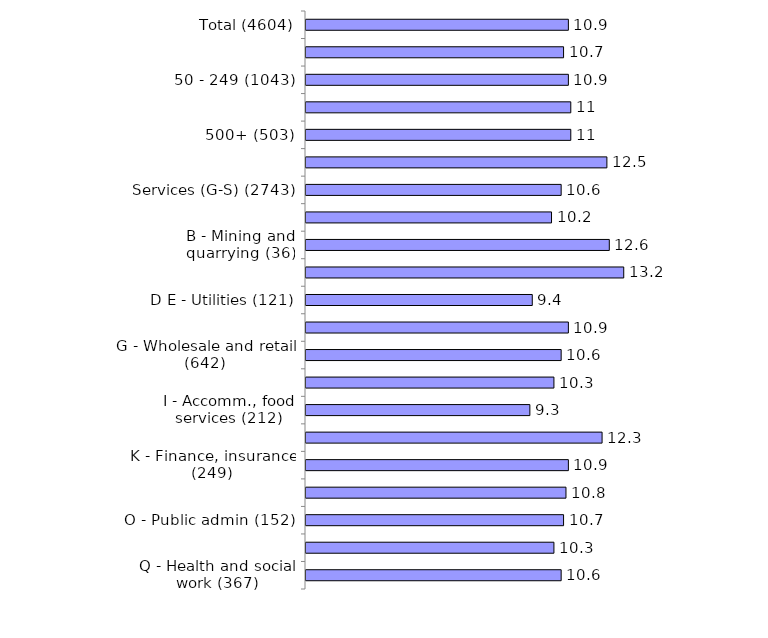
| Category | Series 0 |
|---|---|
| Total (4604) | 10.9 |
| 10-49 (2678) | 10.7 |
| 50 - 249 (1043) | 10.9 |
| 250 - 499 (380) | 11 |
| 500+ (503) | 11 |
| Production (A-F) (1861) | 12.5 |
| Services (G-S) (2743) | 10.6 |
| A - Agriculture (135) | 10.2 |
| B - Mining and quarrying (36) | 12.6 |
| C - Manufacturing (1396) | 13.2 |
| D E - Utilities (121) | 9.4 |
| F - Construction (173) | 10.9 |
| G - Wholesale and retail (642) | 10.6 |
| H - Transport, storage (203) | 10.3 |
| I - Accomm., food services (212) | 9.3 |
| J - Information, comms (170) | 12.3 |
| K - Finance, insurance (249) | 10.9 |
| LMNRS - Bus/tech/admin/arts/other (366) | 10.8 |
| O - Public admin (152) | 10.7 |
| P - Education (382) | 10.3 |
| Q - Health and social work (367) | 10.6 |